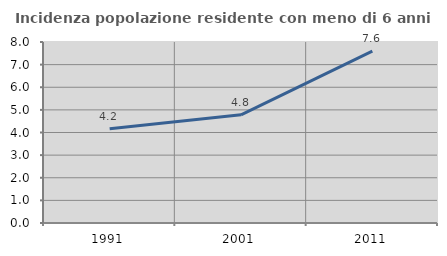
| Category | Incidenza popolazione residente con meno di 6 anni |
|---|---|
| 1991.0 | 4.167 |
| 2001.0 | 4.781 |
| 2011.0 | 7.595 |